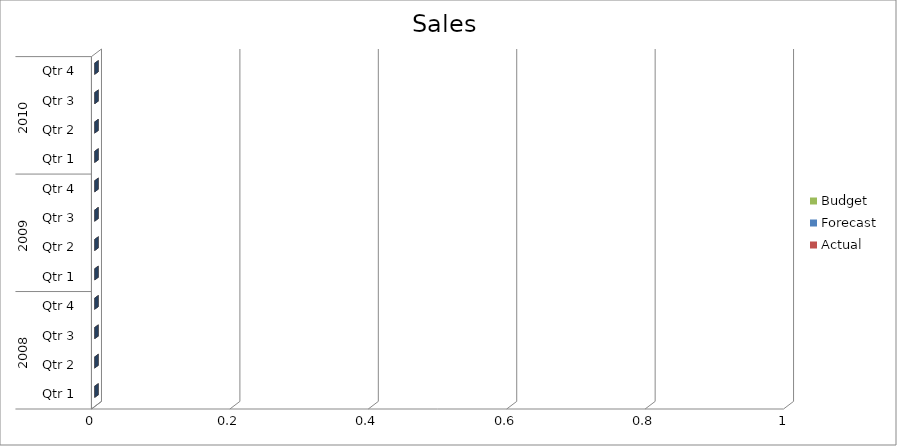
| Category | Budget | Forecast | Actual |
|---|---|---|---|
| 0 | 1050 | 620 | 2700 |
| 1 | 2390 | 2740 | 2050 |
| 2 | 2070 | 3180 | 2850 |
| 3 | 3030 | 1930 | 2350 |
| 4 | 3100 | 2290 | 1380 |
| 5 | 2920 | 3370 | 1260 |
| 6 | 640 | 1200 | 1780 |
| 7 | 2030 | 2320 | 2940 |
| 8 | 1950 | 640 | 3280 |
| 9 | 3060 | 880 | 950 |
| 10 | 1020 | 1320 | 1200 |
| 11 | 2800 | 1870 | 520 |